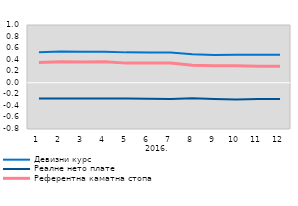
| Category | Девизни курс | Реалне нето плате | Референтна каматна стопа |
|---|---|---|---|
| 0 | 0.528 | -0.271 | 0.349 |
| 1900-01-01 | 0.539 | -0.273 | 0.366 |
| 1900-01-02 | 0.538 | -0.272 | 0.36 |
| 1900-01-03 | 0.538 | -0.274 | 0.363 |
| 1900-01-04 | 0.526 | -0.274 | 0.34 |
| 1900-01-05 | 0.523 | -0.278 | 0.34 |
| 1900-01-06 | 0.522 | -0.282 | 0.344 |
| 1900-01-07 | 0.493 | -0.267 | 0.304 |
| 1900-01-08 | 0.48 | -0.279 | 0.294 |
| 1900-01-09 | 0.487 | -0.288 | 0.293 |
| 1900-01-10 | 0.483 | -0.28 | 0.285 |
| 1900-01-11 | 0.483 | -0.28 | 0.285 |